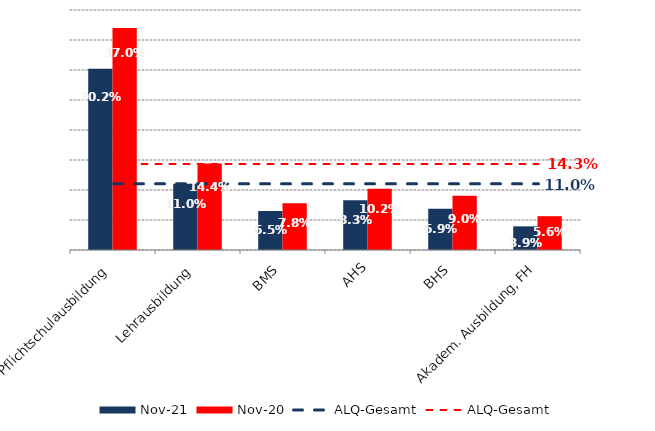
| Category | Nov 21 | Nov 20 |
|---|---|---|
| Pflichtschulausbildung | 0.302 | 0.37 |
| Lehrausbildung | 0.11 | 0.144 |
| BMS | 0.065 | 0.078 |
| AHS | 0.083 | 0.102 |
| BHS | 0.069 | 0.09 |
| Akadem. Ausbildung, FH | 0.039 | 0.056 |